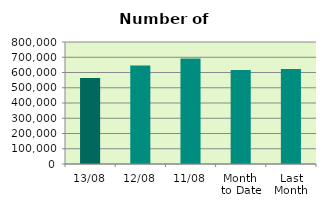
| Category | Series 0 |
|---|---|
| 13/08 | 564090 |
| 12/08 | 646432 |
| 11/08 | 692436 |
| Month 
to Date | 615698.889 |
| Last
Month | 622411.826 |